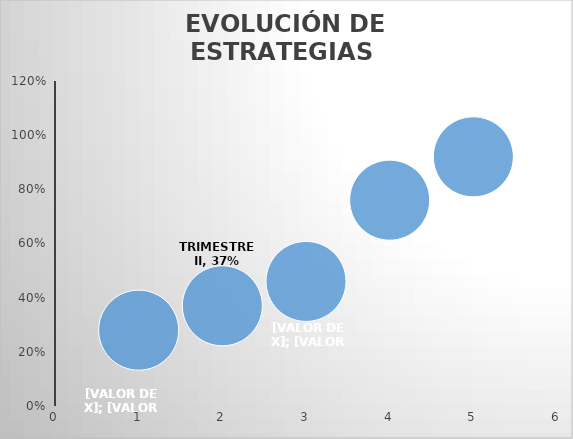
| Category | Series 0 |
|---|---|
| 0 | 0.28 |
| 1 | 0.37 |
| 2 | 0.46 |
| 3 | 0.76 |
| 4 | 0.92 |